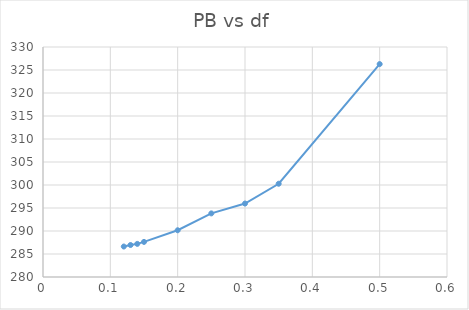
| Category | PB |
|---|---|
| 0.12 | 286.626 |
| 0.13 | 286.953 |
| 0.14 | 287.2 |
| 0.15 | 287.629 |
| 0.2 | 290.16 |
| 0.25 | 293.828 |
| 0.3 | 295.971 |
| 0.35 | 300.274 |
| 0.5 | 326.286 |